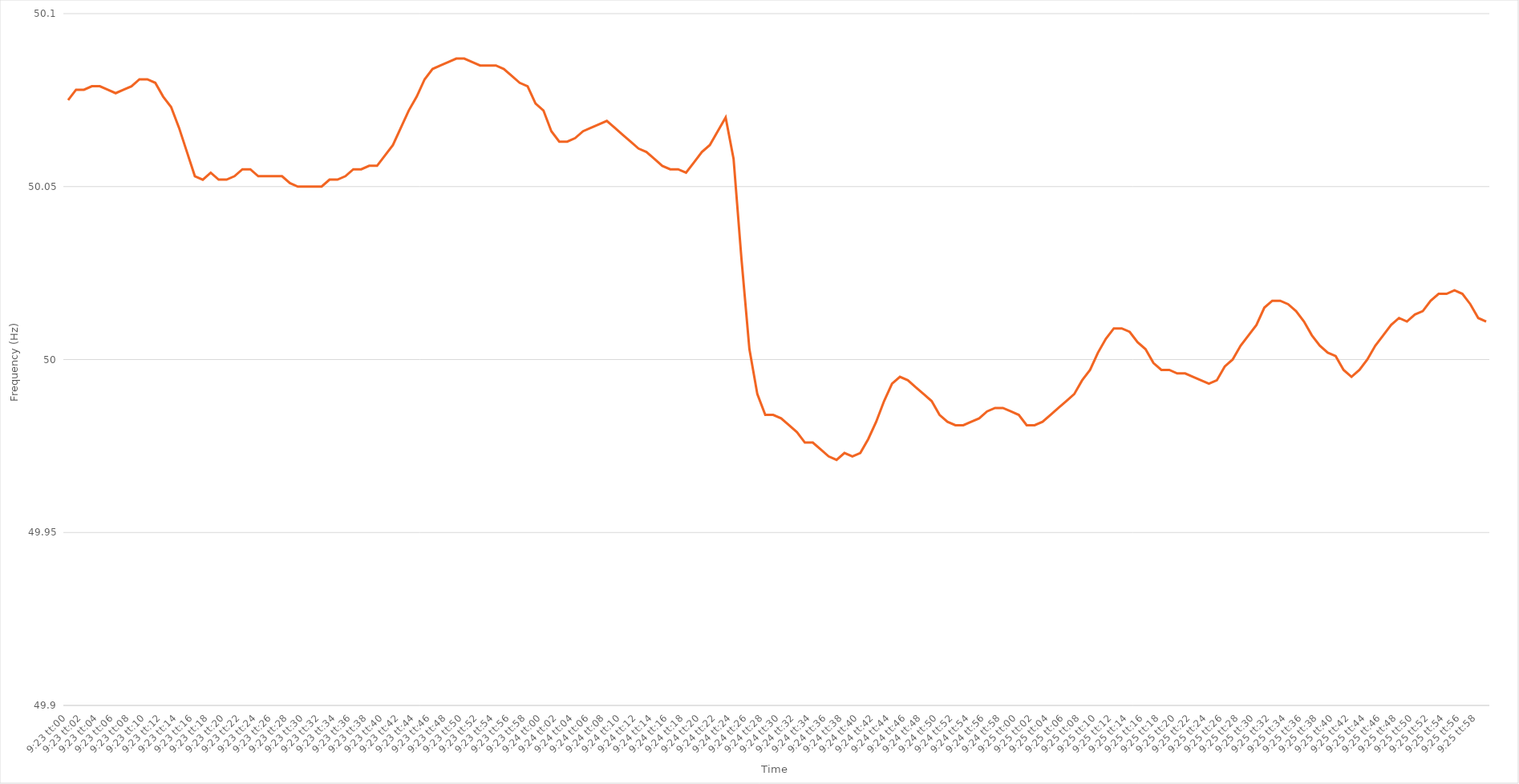
| Category | Series 0 |
|---|---|
| 0.3909722222222222 | 50.075 |
| 0.3909837962962963 | 50.078 |
| 0.39099537037037035 | 50.078 |
| 0.39100694444444445 | 50.079 |
| 0.3910185185185185 | 50.079 |
| 0.39103009259259264 | 50.078 |
| 0.3910416666666667 | 50.077 |
| 0.39105324074074077 | 50.078 |
| 0.3910648148148148 | 50.079 |
| 0.3910763888888889 | 50.081 |
| 0.39108796296296294 | 50.081 |
| 0.391099537037037 | 50.08 |
| 0.39111111111111113 | 50.076 |
| 0.39112268518518517 | 50.073 |
| 0.39113425925925926 | 50.067 |
| 0.3911458333333333 | 50.06 |
| 0.3911574074074074 | 50.053 |
| 0.39116898148148144 | 50.052 |
| 0.3911805555555556 | 50.054 |
| 0.3911921296296296 | 50.052 |
| 0.3912037037037037 | 50.052 |
| 0.39121527777777776 | 50.053 |
| 0.39122685185185185 | 50.055 |
| 0.3912384259259259 | 50.055 |
| 0.39125000000000004 | 50.053 |
| 0.3912615740740741 | 50.053 |
| 0.3912731481481482 | 50.053 |
| 0.3912847222222222 | 50.053 |
| 0.3912962962962963 | 50.051 |
| 0.39130787037037035 | 50.05 |
| 0.3913194444444445 | 50.05 |
| 0.39133101851851854 | 50.05 |
| 0.39134259259259263 | 50.05 |
| 0.39135416666666667 | 50.052 |
| 0.3913657407407407 | 50.052 |
| 0.3913773148148148 | 50.053 |
| 0.39138888888888884 | 50.055 |
| 0.391400462962963 | 50.055 |
| 0.39141203703703703 | 50.056 |
| 0.3914236111111111 | 50.056 |
| 0.39143518518518516 | 50.059 |
| 0.39144675925925926 | 50.062 |
| 0.3914583333333333 | 50.067 |
| 0.39146990740740745 | 50.072 |
| 0.3914814814814815 | 50.076 |
| 0.3914930555555556 | 50.081 |
| 0.3915046296296296 | 50.084 |
| 0.3915162037037037 | 50.085 |
| 0.39152777777777775 | 50.086 |
| 0.3915393518518519 | 50.087 |
| 0.39155092592592594 | 50.087 |
| 0.39156250000000004 | 50.086 |
| 0.3915740740740741 | 50.085 |
| 0.3915856481481481 | 50.085 |
| 0.3915972222222222 | 50.085 |
| 0.39160879629629625 | 50.084 |
| 0.3916203703703704 | 50.082 |
| 0.39163194444444444 | 50.08 |
| 0.39164351851851853 | 50.079 |
| 0.39165509259259257 | 50.074 |
| 0.39166666666666666 | 50.072 |
| 0.3916782407407407 | 50.066 |
| 0.39168981481481485 | 50.063 |
| 0.3917013888888889 | 50.063 |
| 0.391712962962963 | 50.064 |
| 0.391724537037037 | 50.066 |
| 0.3917361111111111 | 50.067 |
| 0.39174768518518516 | 50.068 |
| 0.3917592592592593 | 50.069 |
| 0.39177083333333335 | 50.067 |
| 0.39178240740740744 | 50.065 |
| 0.3917939814814815 | 50.063 |
| 0.3918055555555555 | 50.061 |
| 0.3918171296296296 | 50.06 |
| 0.39182870370370365 | 50.058 |
| 0.3918402777777778 | 50.056 |
| 0.39185185185185184 | 50.055 |
| 0.39186342592592593 | 50.055 |
| 0.391875 | 50.054 |
| 0.39188657407407407 | 50.057 |
| 0.3918981481481481 | 50.06 |
| 0.39190972222222226 | 50.062 |
| 0.3919212962962963 | 50.066 |
| 0.3919328703703704 | 50.07 |
| 0.39194444444444443 | 50.058 |
| 0.3919560185185185 | 50.029 |
| 0.39196759259259256 | 50.003 |
| 0.3919791666666667 | 49.99 |
| 0.39199074074074075 | 49.984 |
| 0.39200231481481485 | 49.984 |
| 0.3920138888888889 | 49.983 |
| 0.392025462962963 | 49.981 |
| 0.392037037037037 | 49.979 |
| 0.39204861111111117 | 49.976 |
| 0.3920601851851852 | 49.976 |
| 0.39207175925925924 | 49.974 |
| 0.39208333333333334 | 49.972 |
| 0.3920949074074074 | 49.971 |
| 0.3921064814814815 | 49.973 |
| 0.3921180555555555 | 49.972 |
| 0.39212962962962966 | 49.973 |
| 0.3921412037037037 | 49.977 |
| 0.3921527777777778 | 49.982 |
| 0.39216435185185183 | 49.988 |
| 0.39217592592592593 | 49.993 |
| 0.39218749999999997 | 49.995 |
| 0.3921990740740741 | 49.994 |
| 0.39221064814814816 | 49.992 |
| 0.39222222222222225 | 49.99 |
| 0.3922337962962963 | 49.988 |
| 0.3922453703703704 | 49.984 |
| 0.3922569444444444 | 49.982 |
| 0.39226851851851857 | 49.981 |
| 0.3922800925925926 | 49.981 |
| 0.39229166666666665 | 49.982 |
| 0.39230324074074074 | 49.983 |
| 0.3923148148148148 | 49.985 |
| 0.3923263888888889 | 49.986 |
| 0.3923379629629629 | 49.986 |
| 0.39234953703703707 | 49.985 |
| 0.3923611111111111 | 49.984 |
| 0.3923726851851852 | 49.981 |
| 0.39238425925925924 | 49.981 |
| 0.39239583333333333 | 49.982 |
| 0.39240740740740737 | 49.984 |
| 0.3924189814814815 | 49.986 |
| 0.39243055555555556 | 49.988 |
| 0.39244212962962965 | 49.99 |
| 0.3924537037037037 | 49.994 |
| 0.3924652777777778 | 49.997 |
| 0.3924768518518518 | 50.002 |
| 0.392488425925926 | 50.006 |
| 0.3925 | 50.009 |
| 0.39251157407407405 | 50.009 |
| 0.39252314814814815 | 50.008 |
| 0.3925347222222222 | 50.005 |
| 0.3925462962962963 | 50.003 |
| 0.3925578703703703 | 49.999 |
| 0.39256944444444447 | 49.997 |
| 0.3925810185185185 | 49.997 |
| 0.3925925925925926 | 49.996 |
| 0.39260416666666664 | 49.996 |
| 0.39261574074074074 | 49.995 |
| 0.3926273148148148 | 49.994 |
| 0.3926388888888889 | 49.993 |
| 0.39265046296296297 | 49.994 |
| 0.39266203703703706 | 49.998 |
| 0.3926736111111111 | 50 |
| 0.3926851851851852 | 50.004 |
| 0.39269675925925923 | 50.007 |
| 0.3927083333333334 | 50.01 |
| 0.3927199074074074 | 50.015 |
| 0.3927314814814815 | 50.017 |
| 0.39274305555555555 | 50.017 |
| 0.39275462962962965 | 50.016 |
| 0.3927662037037037 | 50.014 |
| 0.3927777777777777 | 50.011 |
| 0.3927893518518519 | 50.007 |
| 0.3928009259259259 | 50.004 |
| 0.3928125 | 50.002 |
| 0.39282407407407405 | 50.001 |
| 0.39283564814814814 | 49.997 |
| 0.3928472222222222 | 49.995 |
| 0.39285879629629633 | 49.997 |
| 0.39287037037037037 | 50 |
| 0.39288194444444446 | 50.004 |
| 0.3928935185185185 | 50.007 |
| 0.3929050925925926 | 50.01 |
| 0.39291666666666664 | 50.012 |
| 0.3929282407407408 | 50.011 |
| 0.3929398148148148 | 50.013 |
| 0.3929513888888889 | 50.014 |
| 0.39296296296296296 | 50.017 |
| 0.39297453703703705 | 50.019 |
| 0.3929861111111111 | 50.019 |
| 0.39299768518518513 | 50.02 |
| 0.3930092592592593 | 50.019 |
| 0.3930208333333333 | 50.016 |
| 0.3930324074074074 | 50.012 |
| 0.39304398148148145 | 50.011 |